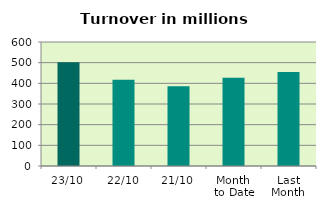
| Category | Series 0 |
|---|---|
| 23/10 | 502.104 |
| 22/10 | 417.013 |
| 21/10 | 386.25 |
| Month 
to Date | 426.763 |
| Last
Month | 454.566 |